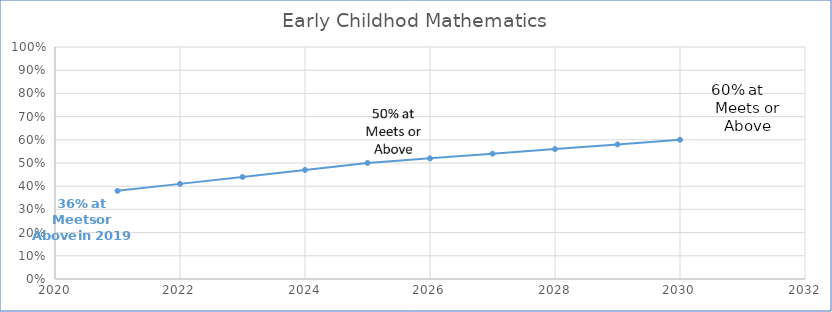
| Category | Series 0 |
|---|---|
| 2021.0 | 0.38 |
| 2022.0 | 0.41 |
| 2023.0 | 0.44 |
| 2024.0 | 0.47 |
| 2025.0 | 0.5 |
| 2026.0 | 0.52 |
| 2027.0 | 0.54 |
| 2028.0 | 0.56 |
| 2029.0 | 0.58 |
| 2030.0 | 0.6 |